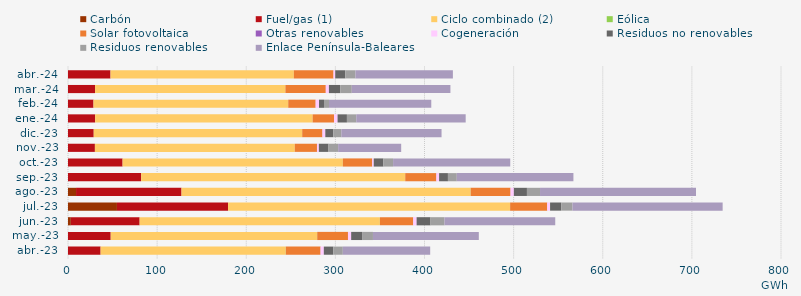
| Category | Carbón | Fuel/gas (1) | Ciclo combinado (2) | Eólica | Solar fotovoltaica | Otras renovables | Cogeneración | Residuos no renovables | Residuos renovables | Enlace Península-Baleares |
|---|---|---|---|---|---|---|---|---|---|---|
| abr.-23 | -0.609 | 36.577 | 207.738 | 0.127 | 38.896 | 0.098 | 3.596 | 10.657 | 10.657 | 98.033 |
| may.-23 | -0.833 | 47.925 | 231.475 | 0.25 | 34.459 | 0.144 | 3.463 | 12.229 | 12.229 | 118.762 |
| jun.-23 | 3.18 | 77.204 | 269.55 | 0.056 | 37.286 | 0.14 | 3.733 | 15.598 | 15.598 | 124.35 |
| jul.-23 | 54.925 | 124.683 | 316.355 | 0.119 | 41.537 | 0.102 | 3.18 | 12.541 | 12.541 | 168.548 |
| ago.-23 | 9.023 | 118.34 | 324.377 | 0.098 | 44.65 | 0.092 | 3.675 | 14.683 | 14.683 | 175.009 |
| sep.-23 | -0.823 | 82.054 | 296.323 | 0 | 34.851 | 0.141 | 2.995 | 9.934 | 9.934 | 130.855 |
| oct.-23 | -0.827 | 61.254 | 247.113 | 0.01 | 32.889 | 0.148 | 1.621 | 10.861 | 10.861 | 131.447 |
| nov.-23 | -0.895 | 30.185 | 224.261 | 0.009 | 24.885 | 0.144 | 1.997 | 10.81 | 10.81 | 70.736 |
| dic.-23 | -0.696 | 28.871 | 233.915 | 0 | 22.637 | 0.126 | 3.157 | 8.992 | 8.992 | 112.44 |
| ene.-24 | -0.706 | 30.444 | 244.02 | 0 | 23.97 | 0.104 | 3.937 | 10.485 | 10.485 | 122.76 |
| feb.-24 | -0.663 | 28.622 | 218.491 | 0 | 30.744 | 0.04 | 3.74 | 5.609 | 5.609 | 114.744 |
| mar.-24 | -0.71 | 30.374 | 213.549 | 0 | 45.305 | 0.04 | 3.485 | 12.829 | 12.829 | 110.668 |
| abr.-24 | -0.939 | 47.711 | 205.682 | 0 | 44.52 | 0.016 | 1.91 | 11.323 | 11.323 | 109.362 |